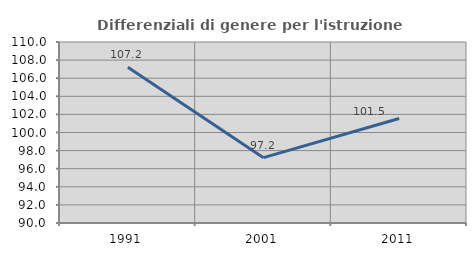
| Category | Differenziali di genere per l'istruzione superiore |
|---|---|
| 1991.0 | 107.196 |
| 2001.0 | 97.222 |
| 2011.0 | 101.55 |